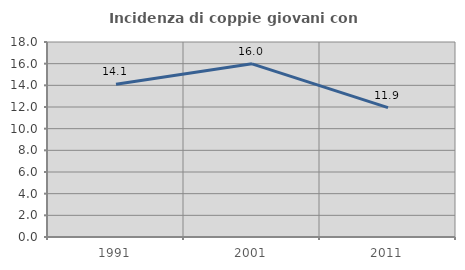
| Category | Incidenza di coppie giovani con figli |
|---|---|
| 1991.0 | 14.091 |
| 2001.0 | 15.984 |
| 2011.0 | 11.947 |